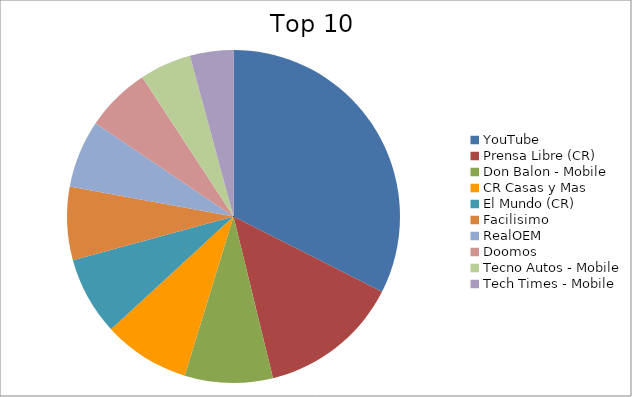
| Category | Series 0 |
|---|---|
| YouTube | 10.56 |
| Prensa Libre (CR) | 4.46 |
| Don Balon - Mobile | 2.78 |
| CR Casas y Mas | 2.74 |
| El Mundo (CR) | 2.47 |
| Facilisimo | 2.32 |
| RealOEM | 2.14 |
| Doomos | 2.05 |
| Tecno Autos - Mobile | 1.63 |
| Tech Times - Mobile | 1.37 |